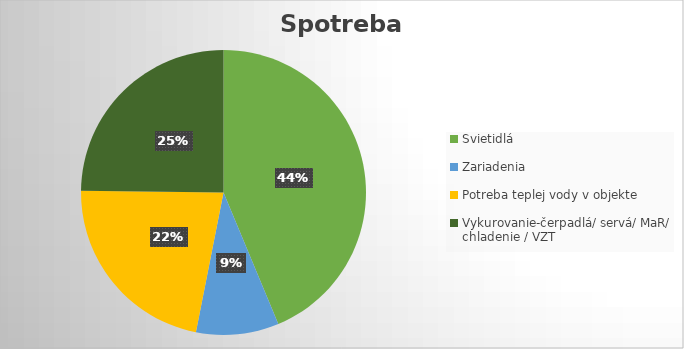
| Category | Spotreba kWh |
|---|---|
| Svietidlá | 4950 |
| Zariadenia | 1062.5 |
| Potreba teplej vody v objekte | 2500 |
| Vykurovanie-čerpadlá/ servá/ MaR/ chladenie / VZT | 2809.901 |